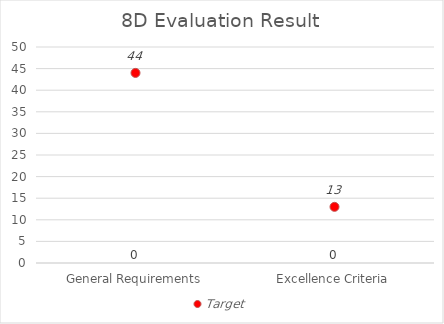
| Category | 8D Evaluation |
|---|---|
| General Requirements | 0 |
| Excellence Criteria | 0 |